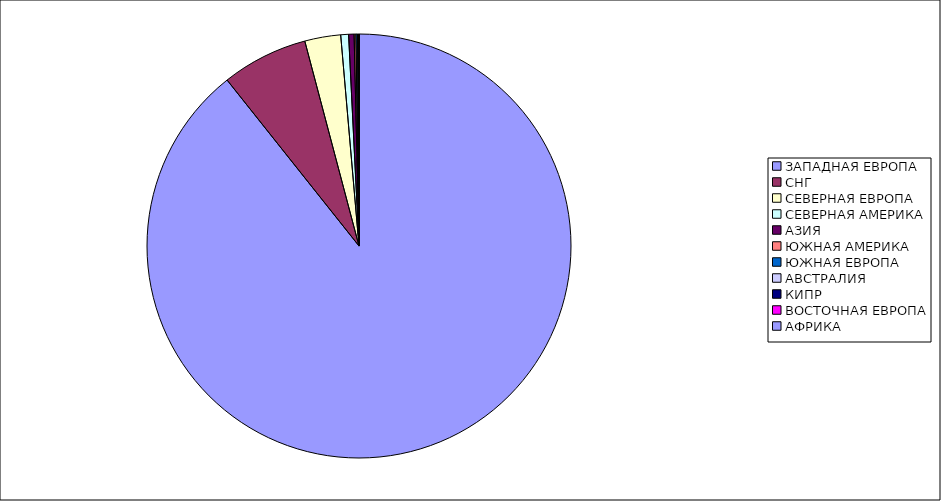
| Category | Оборот |
|---|---|
| ЗАПАДНАЯ ЕВРОПА | 0.893 |
| СНГ | 0.066 |
| СЕВЕРНАЯ ЕВРОПА | 0.027 |
| СЕВЕРНАЯ АМЕРИКА | 0.006 |
| АЗИЯ | 0.004 |
| ЮЖНАЯ АМЕРИКА | 0.001 |
| ЮЖНАЯ ЕВРОПА | 0.001 |
| АВСТРАЛИЯ | 0.001 |
| КИПР | 0 |
| ВОСТОЧНАЯ ЕВРОПА | 0 |
| АФРИКА | 0 |